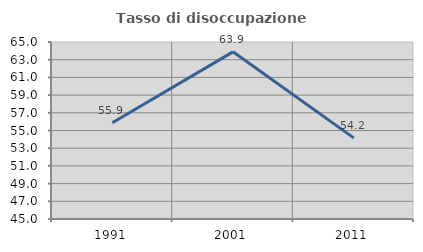
| Category | Tasso di disoccupazione giovanile  |
|---|---|
| 1991.0 | 55.882 |
| 2001.0 | 63.889 |
| 2011.0 | 54.167 |